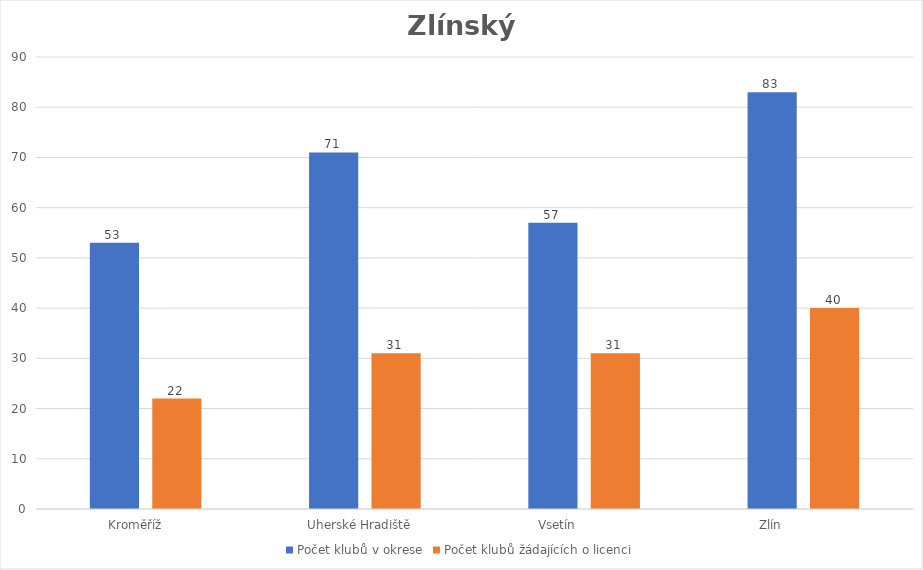
| Category | Počet klubů v okrese | Počet klubů žádajících o licenci |
|---|---|---|
| Kroměříž      | 53 | 22 |
| Uherské Hradiště   | 71 | 31 |
| Vsetín              | 57 | 31 |
| Zlín                 | 83 | 40 |